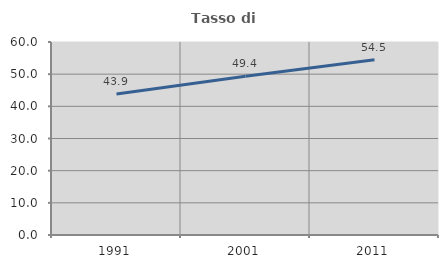
| Category | Tasso di occupazione   |
|---|---|
| 1991.0 | 43.863 |
| 2001.0 | 49.361 |
| 2011.0 | 54.458 |